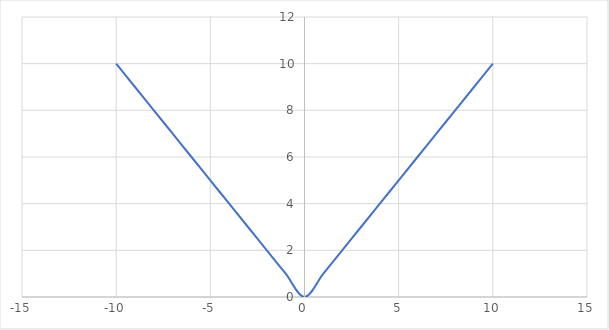
| Category | Series 0 |
|---|---|
| -10.0 | 10 |
| -9.0 | 9 |
| -8.0 | 8 |
| -7.0 | 7 |
| -6.0 | 6 |
| -5.0 | 5 |
| -4.0 | 4 |
| -3.0 | 3 |
| -2.0 | 2 |
| -1.0 | 1 |
| 0.0 | 0 |
| 1.0 | 1 |
| 2.0 | 2 |
| 3.0 | 3 |
| 4.0 | 4 |
| 5.0 | 5 |
| 6.0 | 6 |
| 7.0 | 7 |
| 8.0 | 8 |
| 9.0 | 9 |
| 10.0 | 10 |